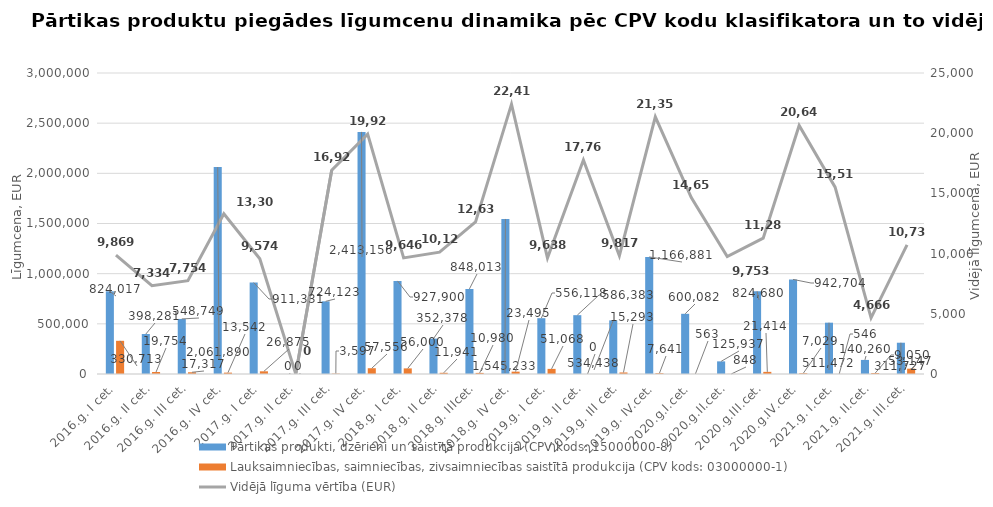
| Category | Pārtikas produkti, dzērieni un saistītā produkcija (CPV kods: 15000000-8) | Lauksaimniecības, saimniecības, zivsaimniecības saistītā produkcija (CPV kods: 03000000-1) |
|---|---|---|
| 2016.g. I cet. | 824017 | 330713 |
| 2016.g. II cet. | 398281 | 19754 |
| 2016.g. III cet. | 548749.01 | 17317 |
| 2016.g. IV cet. | 2061890 | 13542 |
| 2017.g. I cet. | 911330.81 | 26874.91 |
| 2017.g. II cet. | 0 | 0 |
| 2017.g. III cet. | 724123.07 | 3596.6 |
| 2017.g. IV cet. | 2413156 | 57556 |
| 2018.g. I cet. | 927900 | 56000 |
| 2018.g. II cet. | 352378 | 11941 |
| 2018.g. IIIcet. | 848013 | 10980 |
| 2018.g. IV cet. | 1545233 | 23495 |
| 2019.g. I cet. | 556118 | 51068 |
| 2019.g. II cet. | 586383 | 0 |
| 2019.g. III cet. | 534438 | 15293 |
| 2019.g. IV.cet. | 1166881 | 7641 |
| 2020.g.I.cet. | 600082 | 563 |
| 2020.g.II.cet. | 125937 | 848 |
| 2020.g.III.cet. | 824680 | 21414 |
| 2020.g.IV.cet. | 942704 | 7029 |
| 2021.g. I.cet. | 511472 | 546 |
| 2021.g. II.cet. | 140260 | 9050 |
| 2021.g. III.cet. | 311727 | 53147 |